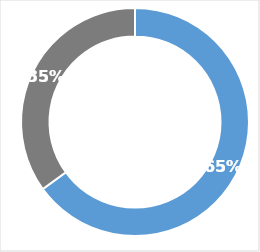
| Category | Series 0 |
|---|---|
| 0 | 0.65 |
| 1 | 0.35 |